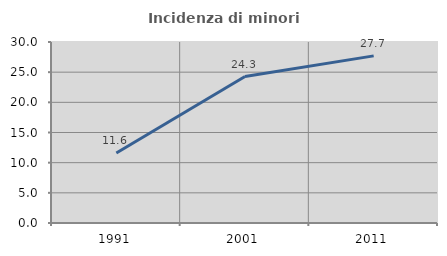
| Category | Incidenza di minori stranieri |
|---|---|
| 1991.0 | 11.61 |
| 2001.0 | 24.273 |
| 2011.0 | 27.7 |